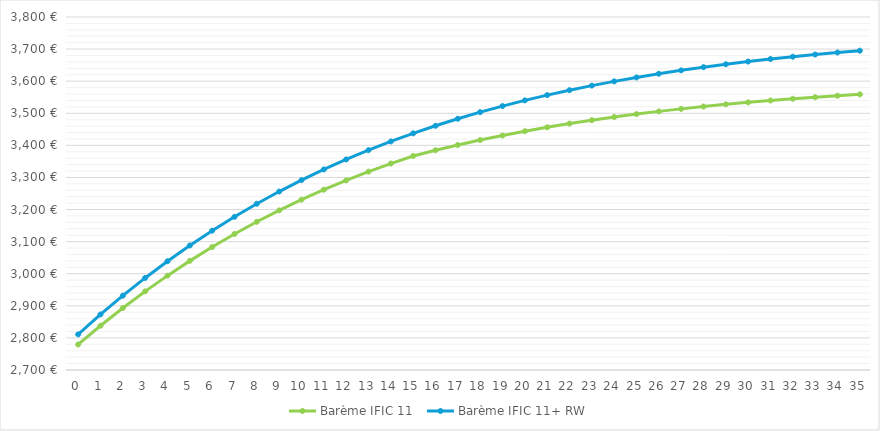
| Category | Barème IFIC 11  | Barème IFIC 11+ RW |
|---|---|---|
| 0.0 | 2779.6 | 2811.11 |
| 1.0 | 2837.96 | 2873.04 |
| 2.0 | 2893.09 | 2931.6 |
| 3.0 | 2945.08 | 2986.9 |
| 4.0 | 2994.03 | 3038.99 |
| 5.0 | 3040.05 | 3088.03 |
| 6.0 | 3083.28 | 3134.14 |
| 7.0 | 3123.84 | 3177.42 |
| 8.0 | 3161.85 | 3218.01 |
| 9.0 | 3197.44 | 3256.05 |
| 10.0 | 3230.74 | 3291.67 |
| 11.0 | 3261.85 | 3324.95 |
| 12.0 | 3290.91 | 3356.06 |
| 13.0 | 3318.03 | 3385.11 |
| 14.0 | 3343.3 | 3412.21 |
| 15.0 | 3366.88 | 3437.48 |
| 16.0 | 3384.66 | 3461.02 |
| 17.0 | 3401.18 | 3482.95 |
| 18.0 | 3416.55 | 3503.39 |
| 19.0 | 3430.83 | 3522.43 |
| 20.0 | 3444.08 | 3540.13 |
| 21.0 | 3456.39 | 3556.61 |
| 22.0 | 3467.83 | 3571.95 |
| 23.0 | 3478.44 | 3586.19 |
| 24.0 | 3488.27 | 3599.42 |
| 25.0 | 3497.41 | 3611.73 |
| 26.0 | 3505.88 | 3623.15 |
| 27.0 | 3513.72 | 3633.75 |
| 28.0 | 3521 | 3643.59 |
| 29.0 | 3527.75 | 3652.71 |
| 30.0 | 3534 | 3661.17 |
| 31.0 | 3539.8 | 3669.04 |
| 32.0 | 3545.16 | 3676.31 |
| 33.0 | 3550.13 | 3683.06 |
| 34.0 | 3554.74 | 3689.33 |
| 35.0 | 3559.01 | 3695.12 |